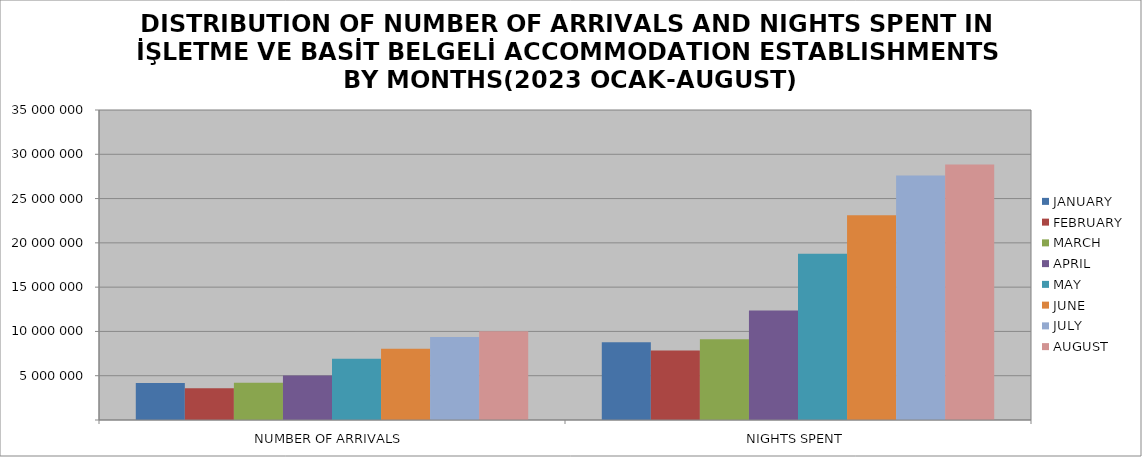
| Category | JANUARY | FEBRUARY | MARCH | APRIL | MAY | JUNE | JULY | AUGUST |
|---|---|---|---|---|---|---|---|---|
| NUMBER OF ARRIVALS | 4176369 | 3577989 | 4200030 | 5022587 | 6927000 | 8050681 | 9379348 | 10028953 |
| NIGHTS SPENT | 8783046 | 7837722 | 9122802 | 12360237 | 18778808 | 23106038 | 27617279 | 28851182 |